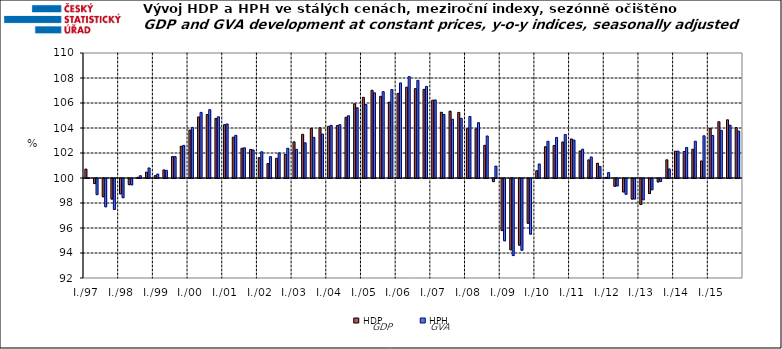
| Category | HDP

 | HPH

 |
|---|---|---|
| I./97 | 100.716 | 100.021 |
|  | 99.595 | 98.712 |
|  | 98.54 | 97.74 |
|  | 98.355 | 97.524 |
| I./98 | 98.77 | 98.464 |
|  | 99.51 | 99.495 |
|  | 100.055 | 100.186 |
|  | 100.472 | 100.803 |
| I./99 | 100.185 | 100.32 |
|  | 100.648 | 100.61 |
|  | 101.713 | 101.715 |
|  | 102.542 | 102.609 |
| I./00 | 103.832 | 104.048 |
|  | 104.887 | 105.25 |
|  | 105.079 | 105.467 |
|  | 104.767 | 104.896 |
| I./01 | 104.271 | 104.323 |
|  | 103.266 | 103.413 |
|  | 102.378 | 102.416 |
|  | 102.286 | 102.244 |
| I./02 | 101.631 | 102.096 |
|  | 101.155 | 101.711 |
|  | 101.575 | 102.005 |
|  | 101.88 | 102.379 |
| I./03 | 102.893 | 102.294 |
|  | 103.496 | 102.816 |
|  | 103.975 | 103.252 |
|  | 104.022 | 103.516 |
| I./04 | 104.138 | 104.214 |
|  | 104.194 | 104.266 |
|  | 104.86 | 104.981 |
|  | 105.94 | 105.62 |
| I./05 | 106.454 | 105.883 |
|  | 107.019 | 106.815 |
|  | 106.531 | 106.907 |
|  | 106.069 | 107.074 |
| I./06 | 106.769 | 107.604 |
|  | 107.267 | 108.11 |
|  | 107.149 | 107.817 |
|  | 107.091 | 107.328 |
| I./07 | 106.225 | 106.244 |
|  | 105.261 | 105.079 |
|  | 105.348 | 104.699 |
|  | 105.247 | 104.773 |
| I./08 | 103.95 | 104.923 |
|  | 103.925 | 104.424 |
|  | 102.615 | 103.362 |
|  | 99.754 | 100.954 |
| I./09 | 95.834 | 95.018 |
|  | 94.298 | 93.836 |
|  | 94.669 | 94.26 |
|  | 96.418 | 95.548 |
| I./10 | 100.583 | 101.122 |
|  | 102.501 | 102.939 |
|  | 102.602 | 103.247 |
|  | 102.882 | 103.483 |
| I./11 | 103.123 | 103.036 |
|  | 102.162 | 102.305 |
|  | 101.45 | 101.684 |
|  | 101.183 | 100.927 |
| I./12 | 100.053 | 100.433 |
|  | 99.378 | 99.411 |
|  | 98.926 | 98.739 |
|  | 98.354 | 98.362 |
| I./13 | 97.92 | 98.301 |
|  | 98.796 | 99.101 |
|  | 99.723 | 99.765 |
|  | 101.455 | 100.725 |
| I./14 | 102.147 | 102.149 |
|  | 102.118 | 102.444 |
|  | 102.304 | 102.942 |
|  | 101.363 | 103.377 |
| I./15 | 103.969 | 103.401 |